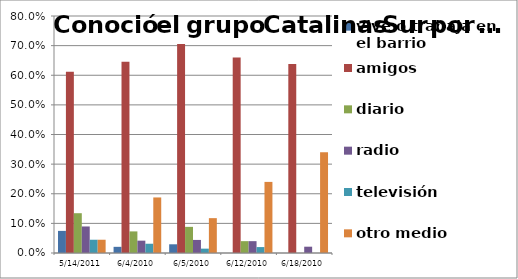
| Category | vive o trabaja en el barrio | amigos | diario | radio | televisión | otro medio |
|---|---|---|---|---|---|---|
| 14/05/2011 | 0.075 | 0.612 | 0.134 | 0.09 | 0.045 | 0.045 |
| 04/06/2010 | 0.021 | 0.646 | 0.073 | 0.042 | 0.031 | 0.188 |
| 05/06/2010 | 0.029 | 0.706 | 0.088 | 0.044 | 0.015 | 0.118 |
| 12/06/2010 | 0 | 0.66 | 0.04 | 0.04 | 0.02 | 0.24 |
| 18/06/2010 | 0 | 0.638 | 0 | 0.021 | 0 | 0.34 |